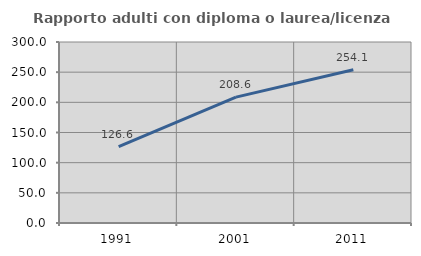
| Category | Rapporto adulti con diploma o laurea/licenza media  |
|---|---|
| 1991.0 | 126.574 |
| 2001.0 | 208.598 |
| 2011.0 | 254.092 |